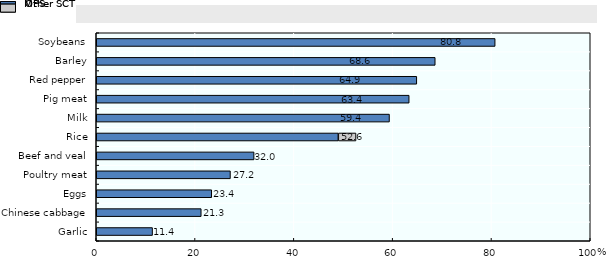
| Category | MPS | Other SCT | Series 3 |
|---|---|---|---|
| Garlic | 11.403 | 0 | 11.403 |
| Chinese cabbage | 21.26 | 0 | 21.26 |
| Eggs | 23.386 | 0 | 23.386 |
| Poultry meat | 27.167 | 0 | 27.167 |
| Beef and veal | 31.958 | 0 | 31.958 |
| Rice | 49.006 | 3.583 | 52.589 |
| Milk | 59.365 | 0 | 59.365 |
| Pig meat | 63.351 | 0 | 63.351 |
| Red pepper | 64.892 | 0 | 64.892 |
| Barley | 68.625 | 0 | 68.625 |
| Soybeans | 80.755 | 0 | 80.755 |